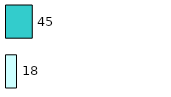
| Category | Series 0 | Series 1 |
|---|---|---|
| 0 | 18 | 45 |